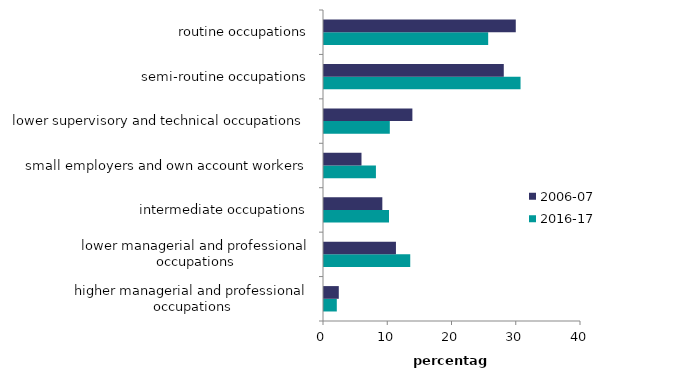
| Category | 2016-17 | 2006-07 |
|---|---|---|
| higher managerial and professional occupations | 1.993 | 2.302 |
| lower managerial and professional occupations | 13.422 | 11.198 |
| intermediate occupations | 10.117 | 9.079 |
| small employers and own account workers | 8.082 | 5.835 |
| lower supervisory and technical occupations | 10.242 | 13.756 |
| semi-routine occupations | 30.591 | 27.982 |
| routine occupations | 25.554 | 29.848 |